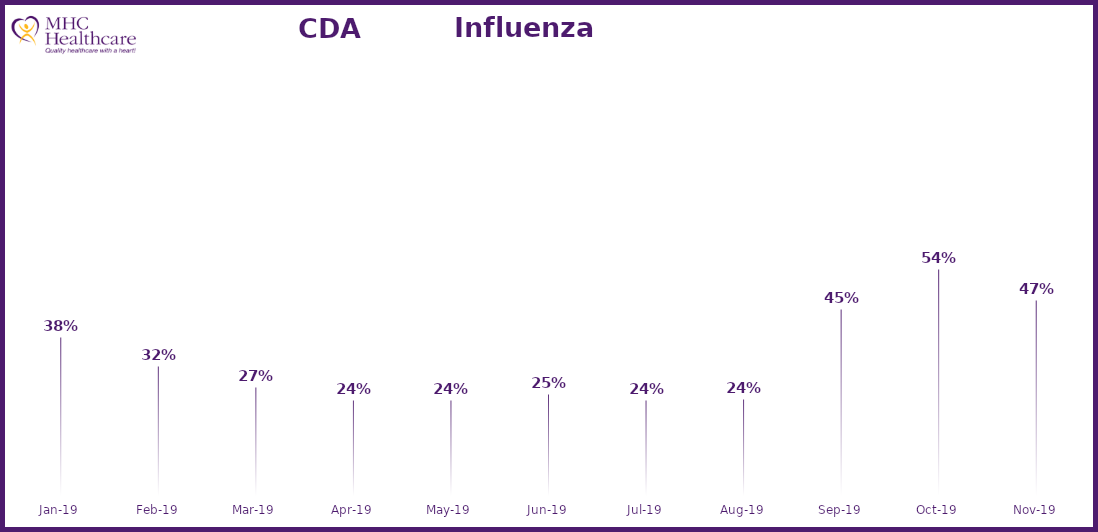
| Category | Online Access to Health Information |
|---|---|
| 2019-01-01 | 0.382 |
| 2019-02-01 | 0.317 |
| 2019-03-01 | 0.27 |
| 2019-04-01 | 0.24 |
| 2019-05-01 | 0.241 |
| 2019-06-01 | 0.254 |
| 2019-07-01 | 0.24 |
| 2019-08-01 | 0.242 |
| 2019-09-01 | 0.447 |
| 2019-10-01 | 0.535 |
| 2019-11-01 | 0.466 |